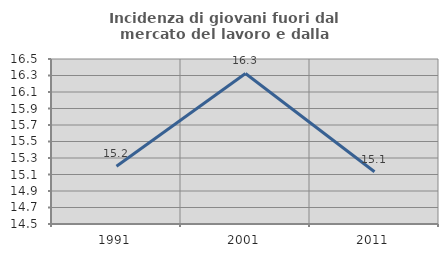
| Category | Incidenza di giovani fuori dal mercato del lavoro e dalla formazione  |
|---|---|
| 1991.0 | 15.199 |
| 2001.0 | 16.325 |
| 2011.0 | 15.133 |